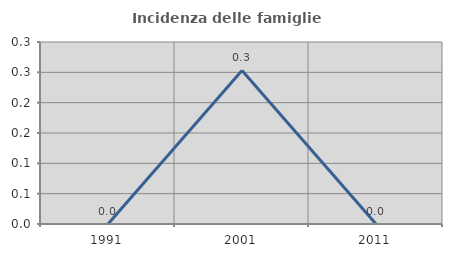
| Category | Incidenza delle famiglie numerose |
|---|---|
| 1991.0 | 0 |
| 2001.0 | 0.253 |
| 2011.0 | 0 |